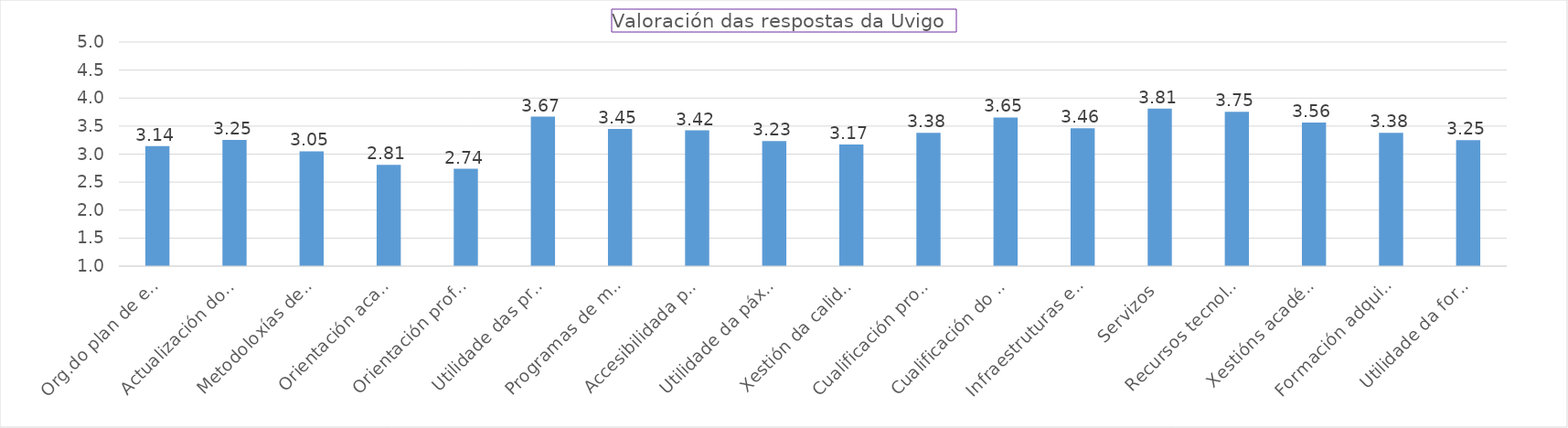
| Category | Series 0 |
|---|---|
| Org.do plan de estudos | 3.143 |
| Actualización dos contidos | 3.254 |
| Metodoloxías de ensino  | 3.051 |
| Orientación académica | 2.806 |
| Orientación profesional | 2.738 |
| Utilidade das prácticas externas | 3.669 |
| Programas de mobilidade | 3.451 |
| Accesibilidada páxina web | 3.424 |
| Utilidade da páxina web | 3.232 |
| Xestión da calidade  | 3.17 |
| Cualificación profesorado | 3.379 |
| Cualificación do PAS  | 3.653 |
| Infraestruturas e materiais | 3.461 |
| Servizos | 3.814 |
| Recursos tecnolóxicos  | 3.755 |
| Xestións académicas | 3.563 |
| Formación adquirida | 3.381 |
| Utilidade da formación | 3.25 |